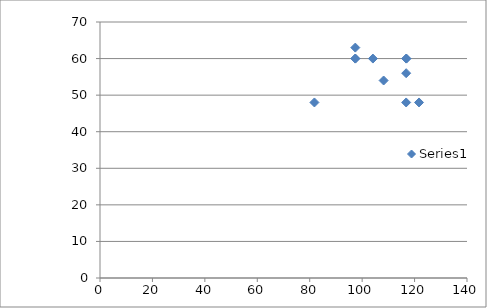
| Category | Series 0 |
|---|---|
| 108.2 | 54 |
| 116.8 | 48 |
| 116.8 | 60 |
| 97.4 | 63 |
| 104.1 | 60 |
| 116.9 | 60 |
| 97.4 | 60 |
| 121.7 | 48 |
| 81.8 | 48 |
| 97.4 | 60 |
| 116.8 | 56 |